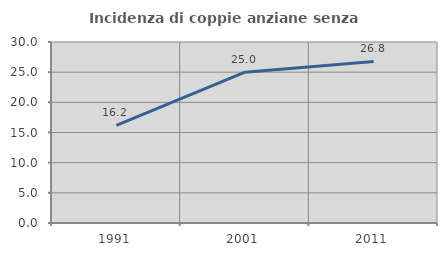
| Category | Incidenza di coppie anziane senza figli  |
|---|---|
| 1991.0 | 16.176 |
| 2001.0 | 25 |
| 2011.0 | 26.786 |